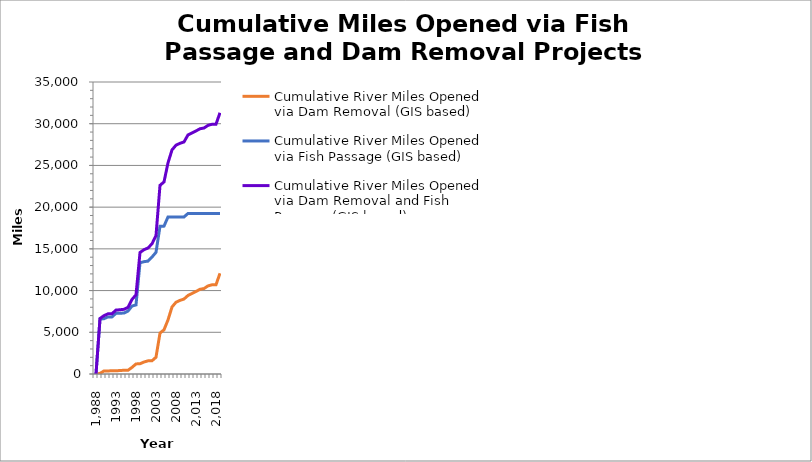
| Category | Cumulative River Miles Opened via Dam Removal (GIS based) | Cumulative River Miles Opened via Fish Passage (GIS based) | Cumulative River Miles Opened via Dam Removal and Fish Passage (GIS based) |
|---|---|---|---|
| 1988 | 0 | 0 | 0 |
| 1989 | 71.619 | 6580.464 | 6652.083 |
| 1990 | 366.987 | 6627.139 | 6994.126 |
| 1991 | 369.218 | 6844.634 | 7213.852 |
| 1992 | 382.745 | 6844.634 | 7227.379 |
| 1993 | 382.745 | 7276.891 | 7659.636 |
| 1994 | 419.236 | 7280.447 | 7699.683 |
| 1995 | 445.698 | 7309.676 | 7755.374 |
| 1996 | 445.698 | 7546.759 | 7992.457 |
| 1997 | 790.421 | 8144.293 | 8934.714 |
| 1998 | 1207.45 | 8279.674 | 9487.124 |
| 1999 | 1228.965 | 13331.606 | 14560.572 |
| 2000 | 1436.672 | 13463.275 | 14899.947 |
| 2001 | 1576.851 | 13528.359 | 15105.21 |
| 2002 | 1584.972 | 14021.183 | 15606.156 |
| 2003 | 2008.836 | 14585.218 | 16594.054 |
| 2004 | 4905.797 | 17706.926 | 22612.723 |
| 2005 | 5297.495 | 17723.711 | 23021.205 |
| 2006 | 6482.065 | 18825.856 | 25307.921 |
| 2007 | 8034.116 | 18825.856 | 26859.972 |
| 2008 | 8601.49 | 18825.856 | 27427.345 |
| 2009 | 8826.177 | 18825.856 | 27652.032 |
| 2010 | 8989.098 | 18825.856 | 27814.954 |
| 2011 | 9413.705 | 19242.432 | 28656.137 |
| 2012 | 9649.288 | 19242.432 | 28891.72 |
| 2013 | 9892.015 | 19242.432 | 29134.447 |
| 2014 | 10154.503 | 19242.432 | 29396.935 |
| 2015 | 10242.82 | 19242.432 | 29485.252 |
| 2016 | 10560.003 | 19242.432 | 29802.435 |
| 2017 | 10691.959 | 19242.432 | 29934.392 |
| 2018 | 10702.541 | 19242.432 | 29944.973 |
| 2019 | 12070.755 | 19242.432 | 31313.187 |